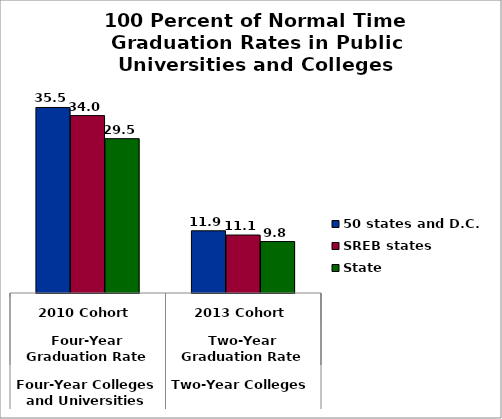
| Category | 50 states and D.C. | SREB states | State |
|---|---|---|---|
| 0 | 35.507 | 33.955 | 29.534 |
| 1 | 11.908 | 11.094 | 9.849 |